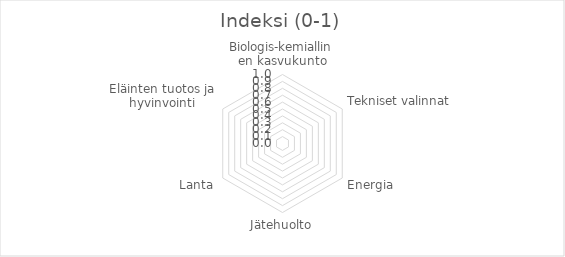
| Category | Indeksi |
|---|---|
| Biologis-kemiallinen kasvukunto | 0 |
| Tekniset valinnat | 0 |
| Energia | 0 |
| Jätehuolto | 0 |
| Lanta | 0 |
| Eläinten tuotos ja hyvinvointi | 0 |